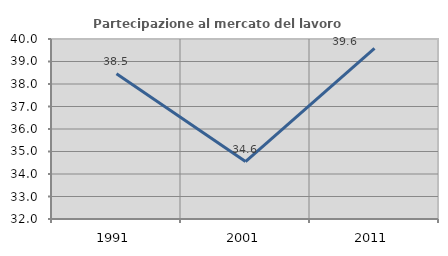
| Category | Partecipazione al mercato del lavoro  femminile |
|---|---|
| 1991.0 | 38.453 |
| 2001.0 | 34.551 |
| 2011.0 | 39.584 |